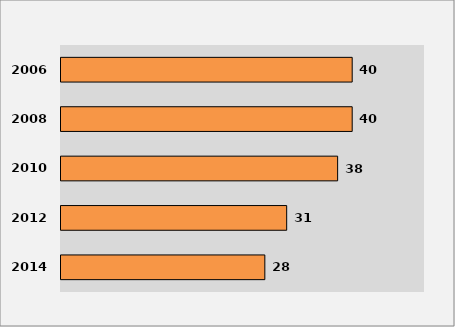
| Category | Series 1 |
|---|---|
| 2014.0 | 28 |
| 2012.0 | 31 |
| 2010.0 | 38 |
| 2008.0 | 40 |
| 2006.0 | 40 |